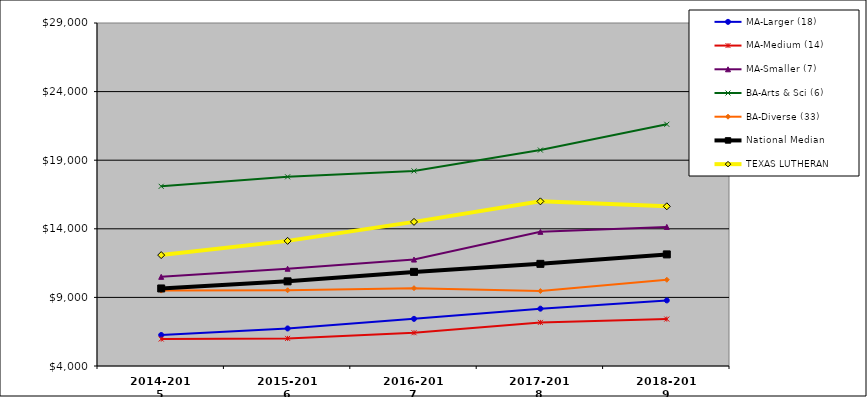
| Category | MA-Larger (18) | MA-Medium (14) | MA-Smaller (7) | BA-Arts & Sci (6) | BA-Diverse (33) | National Median |  TEXAS LUTHERAN  |
|---|---|---|---|---|---|---|---|
| 2014-2015 | 6261.513 | 5966.044 | 10498.448 | 17095.833 | 9494.879 | 9651.331 | 12082.598 |
| 2015-2016 | 6736.172 | 6012.252 | 11089.682 | 17788.63 | 9520.832 | 10170.953 | 13120.524 |
| 2016-2017 | 7436.338 | 6424.237 | 11758.651 | 18220.301 | 9672.052 | 10859.41 | 14503.602 |
| 2017-2018 | 8178.177 | 7177.052 | 13779.066 | 19739.547 | 9463.003 | 11445.61 | 15999.237 |
| 2018-2019 | 8781.324 | 7422.006 | 14138.998 | 21618.04 | 10284.842 | 12133.725 | 15639.308 |